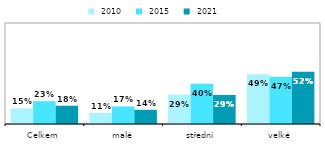
| Category |  2010 |  2015 |  2021 |
|---|---|---|---|
| Celkem | 0.154 | 0.226 | 0.181 |
| malé | 0.11 | 0.174 | 0.141 |
| střední | 0.291 | 0.399 | 0.287 |
| velké | 0.493 | 0.468 | 0.518 |